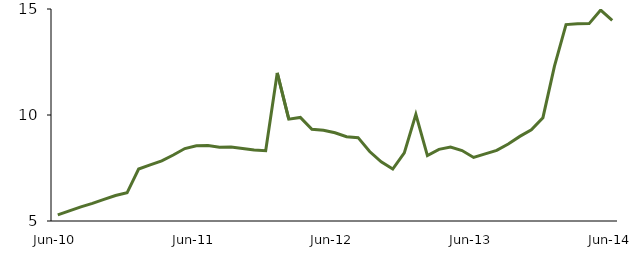
| Category | Series 0 |
|---|---|
| Jun-10 | 5.289 |
|  | 5.477 |
|  | 5.665 |
|  | 5.832 |
|  | 6.02 |
|  | 6.2 |
|  | 6.329 |
|  | 7.453 |
|  | 7.648 |
|  | 7.837 |
|  | 8.113 |
|  | 8.418 |
| Jun-11 | 8.55 |
|  | 8.56 |
|  | 8.474 |
|  | 8.496 |
|  | 8.419 |
|  | 8.351 |
|  | 8.318 |
|  | 11.984 |
|  | 9.805 |
|  | 9.885 |
|  | 9.324 |
|  | 9.282 |
| Jun-12 | 9.163 |
|  | 8.978 |
|  | 8.932 |
|  | 8.279 |
|  | 7.791 |
|  | 7.451 |
|  | 8.216 |
|  | 10.033 |
|  | 8.087 |
|  | 8.381 |
|  | 8.486 |
|  | 8.325 |
| Jun-13 | 7.996 |
|  | 8.165 |
|  | 8.334 |
|  | 8.631 |
|  | 8.992 |
|  | 9.299 |
|  | 9.875 |
|  | 12.304 |
|  | 14.264 |
|  | 14.305 |
|  | 14.31 |
|  | 14.951 |
| Jun-14 | 14.468 |